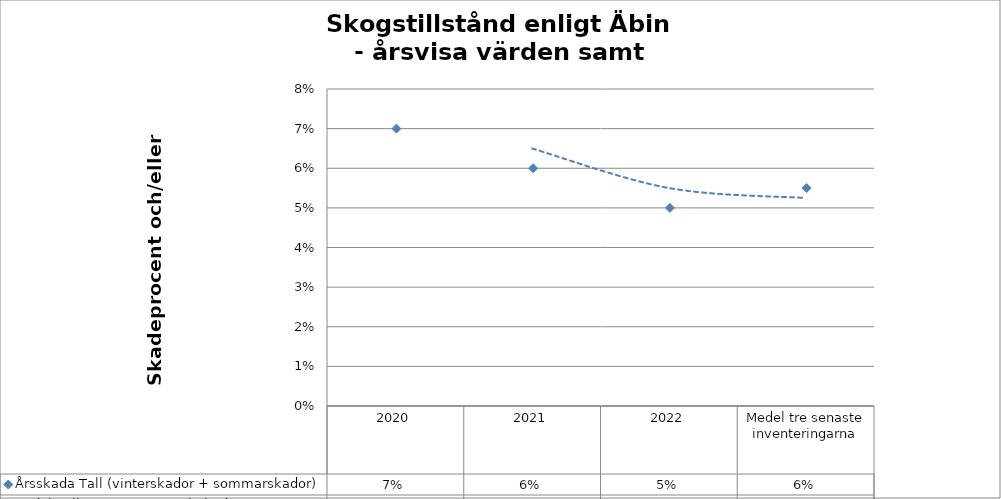
| Category | Årsskada Tall (vinterskador + sommarskador) |
|---|---|
| 2020 | 0.07 |
| 2021 | 0.06 |
| 2022 | 0.05 |
| Medel tre senaste inventeringarna | 0.055 |